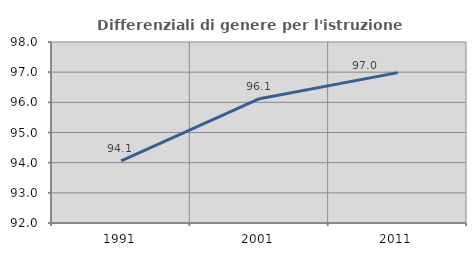
| Category | Differenziali di genere per l'istruzione superiore |
|---|---|
| 1991.0 | 94.057 |
| 2001.0 | 96.122 |
| 2011.0 | 96.984 |